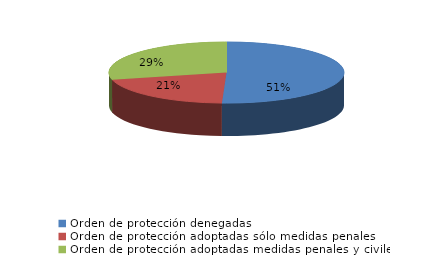
| Category | Series 0 |
|---|---|
| Orden de protección denegadas | 123 |
| Orden de protección adoptadas sólo medidas penales | 50 |
| Orden de protección adoptadas medidas penales y civiles | 70 |